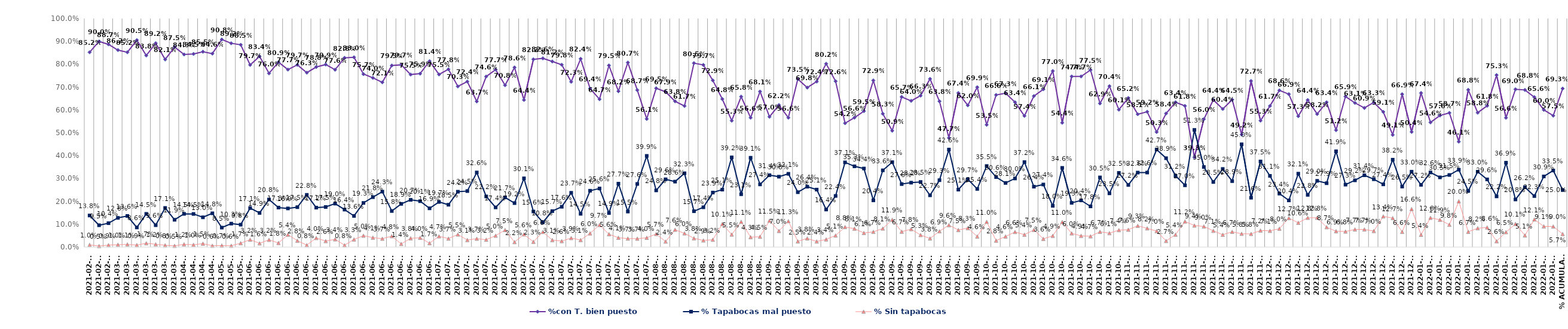
| Category | %con T. bien puesto | % Tapabocas mal puesto | % Sin tapabocas |
|---|---|---|---|
| 2021-02-19 | 0.852 | 0.138 | 0.01 |
| 2021-02-23 | 0.9 | 0.095 | 0.005 |
| 2021-02-25 | 0.887 | 0.104 | 0.009 |
| 2021-03-04 | 0.862 | 0.128 | 0.01 |
| 2021-03-05 | 0.852 | 0.136 | 0.011 |
| 2021-03-10 | 0.905 | 0.086 | 0.009 |
| 2021-03-11 | 0.838 | 0.145 | 0.017 |
| 2021-03-12 | 0.892 | 0.096 | 0.012 |
| 2021-03-29 | 0.821 | 0.171 | 0.008 |
| 2021-03-30 | 0.875 | 0.119 | 0.005 |
| 2021-04-06 | 0.843 | 0.145 | 0.012 |
| 2021-04-07 | 0.845 | 0.145 | 0.01 |
| 2021-04-15 | 0.855 | 0.13 | 0.015 |
| 2021-04-20 | 0.846 | 0.148 | 0.006 |
| 2021-05-04 | 0.908 | 0.085 | 0.007 |
| 2021-05-07 | 0.892 | 0.103 | 0.006 |
| 2021-05-21 | 0.885 | 0.098 | 0.017 |
| 2021-06-01 | 0.797 | 0.171 | 0.032 |
| 2021-06-03 | 0.834 | 0.149 | 0.016 |
| 2021-06-04 | 0.76 | 0.208 | 0.032 |
| 2021-06-08 | 0.809 | 0.173 | 0.018 |
| 2021-06-10 | 0.777 | 0.169 | 0.054 |
| 2021-06-11 | 0.797 | 0.175 | 0.028 |
| 2021-06-12 | 0.763 | 0.228 | 0.008 |
| 2021-06-15 | 0.788 | 0.172 | 0.04 |
| 2021-06-16 | 0.799 | 0.175 | 0.026 |
| 2021-06-17 | 0.776 | 0.19 | 0.034 |
| 2021-06-18 | 0.828 | 0.164 | 0.008 |
| 2021-06-19 | 0.83 | 0.136 | 0.033 |
| 2021-06-21 | 0.757 | 0.193 | 0.05 |
| 2021-06-22 | 0.74 | 0.218 | 0.041 |
| 2021-06-23 | 0.721 | 0.243 | 0.037 |
| 2021-06-24 | 0.795 | 0.158 | 0.048 |
| 2021-06-25 | 0.797 | 0.189 | 0.014 |
| 2021-06-26 | 0.755 | 0.207 | 0.038 |
| 2021-06-29 | 0.759 | 0.201 | 0.04 |
| 2021-06-30 | 0.814 | 0.169 | 0.017 |
| 2021-07-01 | 0.755 | 0.197 | 0.047 |
| 2021-07-02 | 0.778 | 0.185 | 0.037 |
| 2021-07-03 | 0.703 | 0.242 | 0.055 |
| 2021-07-06 | 0.724 | 0.245 | 0.031 |
| 2021-07-07 | 0.637 | 0.326 | 0.037 |
| 2021-07-08 | 0.746 | 0.222 | 0.032 |
| 2021-07-09 | 0.777 | 0.174 | 0.05 |
| 2021-07-10 | 0.708 | 0.217 | 0.075 |
| 2021-07-12 | 0.786 | 0.192 | 0.022 |
| 2021-07-13 | 0.644 | 0.301 | 0.056 |
| 2021-07-14 | 0.822 | 0.156 | 0.023 |
| 2021-07-15 | 0.826 | 0.108 | 0.066 |
| 2021-07-16 | 0.812 | 0.157 | 0.031 |
| 2021-07-17 | 0.798 | 0.176 | 0.026 |
| 2021-07-19 | 0.723 | 0.237 | 0.039 |
| 2021-07-21 | 0.824 | 0.145 | 0.031 |
| 2021-07-22 | 0.694 | 0.246 | 0.06 |
| 2021-07-23 | 0.647 | 0.256 | 0.097 |
| 2021-07-24 | 0.795 | 0.149 | 0.056 |
| 2021-07-28 | 0.682 | 0.277 | 0.041 |
| 2021-07-29 | 0.807 | 0.155 | 0.037 |
| 2021-07-30 | 0.687 | 0.276 | 0.037 |
| 2021-07-31 | 0.561 | 0.399 | 0.04 |
| 2021-08-03 | 0.695 | 0.248 | 0.057 |
| 2021-08-04 | 0.679 | 0.296 | 0.024 |
| 2021-08-05 | 0.638 | 0.286 | 0.076 |
| 2021-08-06 | 0.617 | 0.323 | 0.06 |
| 2021-08-12 | 0.805 | 0.157 | 0.038 |
| 2021-08-17 | 0.797 | 0.174 | 0.029 |
| 2021-08-18 | 0.729 | 0.239 | 0.032 |
| 2021-08-19 | 0.648 | 0.251 | 0.101 |
| 2021-08-20 | 0.553 | 0.392 | 0.055 |
| 2021-08-28 | 0.658 | 0.231 | 0.111 |
| 2021-08-30 | 0.566 | 0.391 | 0.043 |
| 2021-08-31 | 0.681 | 0.274 | 0.045 |
| 2021-09-01 | 0.57 | 0.314 | 0.115 |
| 2021-09-02 | 0.622 | 0.308 | 0.07 |
| 2021-09-03 | 0.566 | 0.321 | 0.113 |
| 2021-09-04 | 0.735 | 0.24 | 0.025 |
| 2021-09-06 | 0.698 | 0.264 | 0.038 |
| 2021-09-08 | 0.724 | 0.251 | 0.024 |
| 2021-09-10 | 0.802 | 0.164 | 0.034 |
| 2021-09-13 | 0.726 | 0.224 | 0.051 |
| 2021-09-14 | 0.542 | 0.371 | 0.088 |
| 2021-09-15 | 0.566 | 0.353 | 0.081 |
| 2021-09-16 | 0.595 | 0.344 | 0.061 |
| 2021-09-17 | 0.729 | 0.204 | 0.067 |
| 2021-09-18 | 0.583 | 0.336 | 0.081 |
| 2021-09-20 | 0.509 | 0.371 | 0.119 |
| 2021-09-21 | 0.657 | 0.276 | 0.067 |
| 2021-09-22 | 0.64 | 0.282 | 0.078 |
| 2021-09-23 | 0.663 | 0.285 | 0.053 |
| 2021-09-24 | 0.736 | 0.227 | 0.038 |
| 2021-09-25 | 0.638 | 0.293 | 0.069 |
| 2021-09-27 | 0.477 | 0.426 | 0.096 |
| 2021-09-28 | 0.674 | 0.251 | 0.075 |
| 2021-09-29 | 0.62 | 0.297 | 0.083 |
| 2021-09-30 | 0.699 | 0.254 | 0.046 |
| 2021-10-01 | 0.535 | 0.355 | 0.11 |
| 2021-10-05 | 0.666 | 0.306 | 0.028 |
| 2021-10-06 | 0.673 | 0.281 | 0.046 |
| 2021-10-11 | 0.634 | 0.3 | 0.066 |
| 2021-10-12 | 0.574 | 0.372 | 0.054 |
| 2021-10-13 | 0.661 | 0.264 | 0.075 |
| 2021-10-14 | 0.691 | 0.274 | 0.036 |
| 2021-10-15 | 0.77 | 0.18 | 0.049 |
| 2021-10-16 | 0.544 | 0.346 | 0.11 |
| 2021-10-19 | 0.747 | 0.193 | 0.06 |
| 2021-10-20 | 0.747 | 0.204 | 0.049 |
| 2021-10-22 | 0.775 | 0.178 | 0.047 |
| 2021-10-26 | 0.629 | 0.305 | 0.067 |
| 2021-10-27 | 0.704 | 0.235 | 0.061 |
| 2021-10-28 | 0.601 | 0.325 | 0.074 |
| 2021-11-02 | 0.652 | 0.272 | 0.076 |
| 2021-11-03 | 0.581 | 0.326 | 0.093 |
| 2021-11-06 | 0.592 | 0.326 | 0.082 |
| 2021-11-09 | 0.503 | 0.427 | 0.07 |
| 2021-11-10 | 0.584 | 0.389 | 0.027 |
| 2021-11-12 | 0.634 | 0.312 | 0.054 |
| 2021-11-17 | 0.618 | 0.27 | 0.112 |
| 2021-11-18 | 0.393 | 0.513 | 0.094 |
| 2021-11-19 | 0.56 | 0.35 | 0.09 |
| 2021-11-22 | 0.644 | 0.285 | 0.071 |
| 2021-11-23 | 0.604 | 0.342 | 0.054 |
| 2021-11-24 | 0.645 | 0.289 | 0.067 |
| 2021-11-25 | 0.492 | 0.45 | 0.058 |
| 2021-11-26 | 0.727 | 0.216 | 0.058 |
| 2021-11-29 | 0.553 | 0.375 | 0.072 |
| 2021-12-03 | 0.617 | 0.311 | 0.071 |
| 2021-12-04 | 0.686 | 0.234 | 0.08 |
| 2021-12-07 | 0.669 | 0.204 | 0.127 |
| 2021-12-09 | 0.573 | 0.321 | 0.106 |
| 2021-12-10 | 0.644 | 0.228 | 0.128 |
| 2021-12-11 | 0.582 | 0.29 | 0.128 |
| 2021-12-13 | 0.634 | 0.279 | 0.087 |
| 2021-12-14 | 0.512 | 0.419 | 0.069 |
| 2021-12-15 | 0.659 | 0.273 | 0.068 |
| 2021-12-17 | 0.631 | 0.292 | 0.077 |
| 2021-12-21 | 0.609 | 0.314 | 0.077 |
| 2021-12-23 | 0.633 | 0.297 | 0.07 |
| 2021-12-24 | 0.591 | 0.274 | 0.134 |
| 2021-12-27 | 0.491 | 0.382 | 0.127 |
| 2021-12-29 | 0.669 | 0.265 | 0.066 |
| 2021-12-31 | 0.504 | 0.33 | 0.166 |
| 2022-01-03 | 0.674 | 0.272 | 0.054 |
| 2022-01-04 | 0.546 | 0.326 | 0.128 |
| 2022-01-06 | 0.576 | 0.305 | 0.119 |
| 2022-01-07 | 0.587 | 0.315 | 0.098 |
| 2022-01-08 | 0.461 | 0.339 | 0.2 |
| 2022-01-11 | 0.688 | 0.245 | 0.067 |
| 2022-01-12 | 0.588 | 0.33 | 0.082 |
| 2022-01-17 | 0.618 | 0.296 | 0.086 |
| 2022-01-18 | 0.753 | 0.222 | 0.026 |
| 2022-01-19 | 0.566 | 0.369 | 0.065 |
| 2022-01-22 | 0.69 | 0.208 | 0.101 |
| 2022-01-24 | 0.688 | 0.262 | 0.051 |
| 2022-01-26 | 0.656 | 0.223 | 0.121 |
| 2022-01-29 | 0.6 | 0.309 | 0.091 |
| 2022-01-31 | 0.575 | 0.335 | 0.09 |
| % Acumulado | 0.693 | 0.25 | 0.057 |